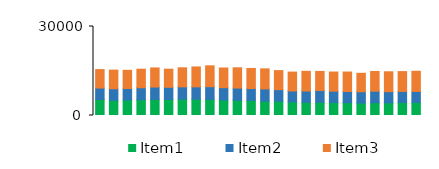
| Category | Item1 | Item2 | Item3 |
|---|---|---|---|
| 0 | 5403 | 3855 | 6216 |
| 1 | 5116 | 3892 | 6291 |
| 2 | 5225 | 3885 | 6116 |
| 3 | 5305 | 4046 | 6260 |
| 4 | 5428 | 4163 | 6443 |
| 5 | 5400 | 4110 | 6104 |
| 6 | 5506 | 4148 | 6420 |
| 7 | 5476 | 4180 | 6705 |
| 8 | 5428 | 4278 | 7039 |
| 9 | 5218 | 4162 | 6635 |
| 10 | 5122 | 4123 | 6831 |
| 11 | 5086 | 3999 | 6771 |
| 12 | 4821 | 4130 | 6775 |
| 13 | 4819 | 3902 | 6412 |
| 14 | 4579 | 3691 | 6364 |
| 15 | 4455 | 3800 | 6638 |
| 16 | 4486 | 3941 | 6428 |
| 17 | 4402 | 3810 | 6443 |
| 18 | 4335 | 3757 | 6570 |
| 19 | 4197 | 3809 | 6219 |
| 20 | 4308 | 3885 | 6655 |
| 21 | 4287 | 3763 | 6685 |
| 22 | 4414 | 3691 | 6693 |
| 23 | 4433 | 3685 | 6797 |